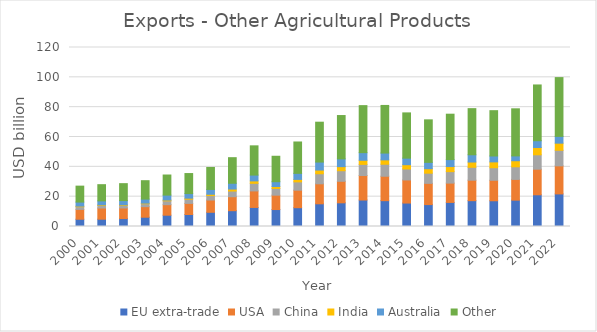
| Category | EU extra-trade | USA | China | India | Australia | Other |
|---|---|---|---|---|---|---|
| 2000.0 | 4870.686 | 6603.893 | 1769.474 | 419.705 | 2706.055 | 10692.201 |
| 2001.0 | 4897.21 | 7488.778 | 1692.837 | 426.755 | 2658.201 | 10878.342 |
| 2002.0 | 5314.717 | 7092.016 | 1742.898 | 404.499 | 2804.802 | 11367.282 |
| 2003.0 | 6225.207 | 7074.711 | 1939.141 | 424.597 | 2709.307 | 12340.606 |
| 2004.0 | 7572.989 | 7055.921 | 2570.972 | 532.943 | 3306.833 | 13476.615 |
| 2005.0 | 8054.623 | 7434.271 | 2826.383 | 662.988 | 3089.278 | 13429.185 |
| 2006.0 | 9520.013 | 8221.569 | 2996.634 | 872.798 | 3232.288 | 14742.584 |
| 2007.0 | 10599.694 | 9360.34 | 3808.576 | 1331.501 | 3880.773 | 17159.517 |
| 2008.0 | 12777.571 | 11080.169 | 5094.973 | 1617.743 | 3899.738 | 19601.888 |
| 2009.0 | 11373.429 | 9640.923 | 4498.633 | 1308.69 | 3206.063 | 17059.639 |
| 2010.0 | 12607.108 | 11741.513 | 5565.132 | 1659.084 | 4053.571 | 21035.089 |
| 2011.0 | 15208.494 | 13415.613 | 6733.279 | 2483.615 | 5362.881 | 26724.381 |
| 2012.0 | 15875.822 | 14442.813 | 7077.749 | 2731.987 | 5202.954 | 29054.434 |
| 2013.0 | 17744.226 | 16448.55 | 7445.084 | 2765.325 | 5103.852 | 31525.907 |
| 2014.0 | 17324.25 | 16370.206 | 8040.51 | 2923.599 | 4582.009 | 31913.956 |
| 2015.0 | 15722.78 | 15477.176 | 7367.657 | 2867.439 | 4381.597 | 30345.983 |
| 2016.0 | 14687.35 | 14232.591 | 6826.542 | 3001.089 | 4252.374 | 28505.22 |
| 2017.0 | 16140.691 | 12956.074 | 7681.309 | 3408.963 | 4669.141 | 30434.979 |
| 2018.0 | 17317.63 | 13730.312 | 8634.09 | 3538.541 | 4866.616 | 30922.28 |
| 2019.0 | 17252.66 | 13730.227 | 8412.613 | 3921.931 | 3953.567 | 30379.574 |
| 2020.0 | 17658.143 | 13914.377 | 8452.507 | 4074.331 | 3223.078 | 31573.702 |
| 2021.0 | 21264.483 | 17157.942 | 9648.145 | 4871.568 | 4563.016 | 37382.904 |
| 2022.0 | 21844.714 | 18816.766 | 10428.827 | 4773.005 | 4557.961 | 39400.488 |